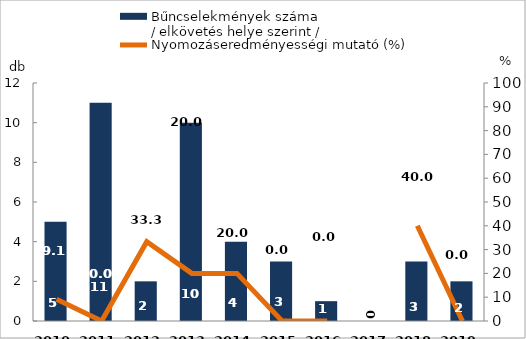
| Category | Bűncselekmények száma
/ elkövetés helye szerint / |
|---|---|
| 2010. év | 5 |
| 2011. év | 11 |
| 2012. év | 2 |
| 2013. év | 10 |
| 2014. év | 4 |
| 2015. év | 3 |
| 2016. év | 1 |
| 2017. év | 0 |
| 2018. év | 3 |
| 2019. év | 2 |